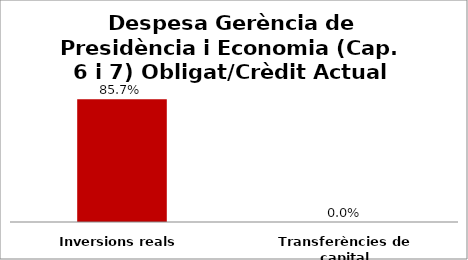
| Category | Series 0 |
|---|---|
| Inversions reals | 0.857 |
| Transferències de capital | 0 |